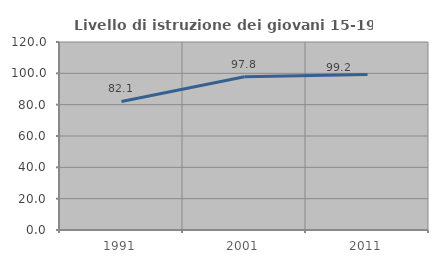
| Category | Livello di istruzione dei giovani 15-19 anni |
|---|---|
| 1991.0 | 82.082 |
| 2001.0 | 97.834 |
| 2011.0 | 99.203 |